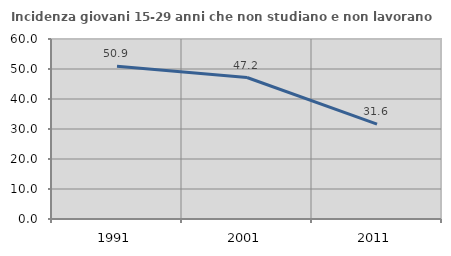
| Category | Incidenza giovani 15-29 anni che non studiano e non lavorano  |
|---|---|
| 1991.0 | 50.909 |
| 2001.0 | 47.165 |
| 2011.0 | 31.605 |